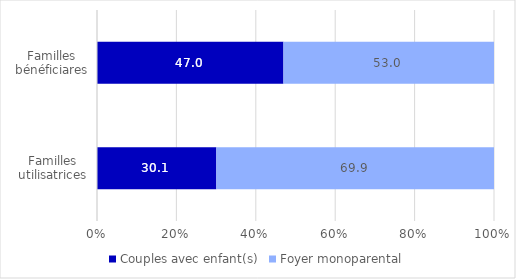
| Category | Couples avec enfant(s) | Foyer monoparental |
|---|---|---|
| Familles utilisatrices | 30.06 | 69.94 |
| Familles bénéficiares | 46.962 | 53.038 |